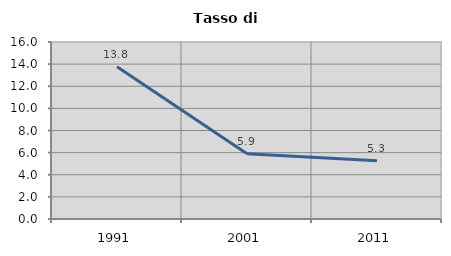
| Category | Tasso di disoccupazione   |
|---|---|
| 1991.0 | 13.76 |
| 2001.0 | 5.906 |
| 2011.0 | 5.275 |